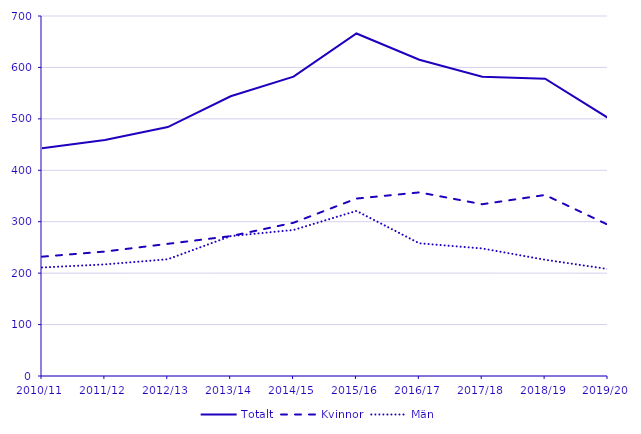
| Category | Totalt | Kvinnor | Män |
|---|---|---|---|
| 2010/11 | 443 | 232 | 211 |
| 2011/12 | 459 | 242 | 217 |
| 2012/13 | 484 | 257 | 227 |
| 2013/14 | 544 | 272 | 272 |
| 2014/15 | 582 | 298 | 284 |
| 2015/16 | 666 | 345 | 321 |
| 2016/17 | 615 | 357 | 258 |
| 2017/18 | 582 | 334 | 248 |
| 2018/19 | 578 | 352 | 226 |
| 2019/20 | 502 | 294 | 208 |